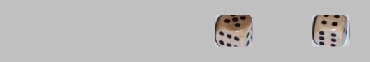
| Category | 1 | 2 | 3 | 4 | 5 | 6 |
|---|---|---|---|---|---|---|
|  | 0 | 0 | 0 | 0 | 0 | 0 |
|  | 0 | 0 | 0 | 0 | 0 | 0 |
|  | 0 | 0 | 0 | 0 | 0 | 0 |
|  | 0 | 0 | 0 | 0 | 0 | 0 |
| 5 | 0 | 0 | 0 | 0 | 1 | 0 |
|  | 0 | 0 | 0 | 0 | 0 | 0 |
| 4 | 0 | 0 | 0 | 1 | 0 | 0 |